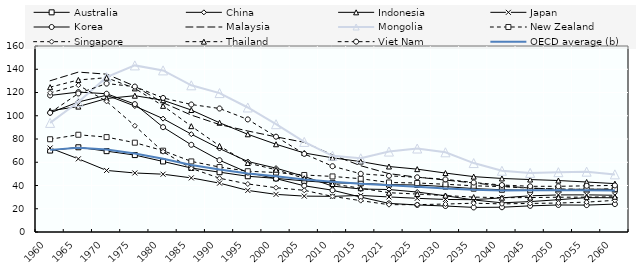
| Category | Australia | China | Indonesia | Japan | Korea | Malaysia | Mongolia | New Zealand | Singapore | Thailand | Viet Nam | OECD average (b) |
|---|---|---|---|---|---|---|---|---|---|---|---|---|
| 1960.0 | 70.051 | 102.435 | 104.271 | 72.241 | 117.466 | 130.089 | 93.835 | 79.8 | 119.711 | 124.572 | 102.552 | 70.643 |
| 1965.0 | 72.878 | 111.873 | 107.889 | 62.934 | 120.356 | 137.553 | 111.751 | 83.643 | 126.319 | 130.796 | 119.199 | 72.543 |
| 1970.0 | 69.556 | 117.649 | 114.832 | 52.969 | 118.927 | 135.774 | 133.173 | 81.627 | 112.347 | 132.723 | 127.67 | 70.866 |
| 1975.0 | 66.169 | 108.355 | 117.237 | 50.774 | 110.011 | 125.464 | 143.316 | 76.84 | 91.353 | 123.522 | 125.098 | 67.554 |
| 1980.0 | 60.675 | 97.511 | 113.324 | 49.724 | 90.192 | 111.181 | 139.009 | 69.95 | 69.075 | 108.514 | 115.306 | 63.089 |
| 1985.0 | 55.049 | 84.157 | 104.92 | 46.558 | 75.01 | 100.577 | 126.193 | 60.719 | 54.759 | 91.04 | 109.682 | 57.555 |
| 1990.0 | 51.44 | 71.78 | 93.984 | 42.026 | 61.736 | 92.421 | 119.49 | 55.89 | 46.242 | 74.069 | 106.247 | 53.682 |
| 1995.0 | 47.956 | 60.636 | 84.053 | 35.77 | 51.146 | 86.897 | 107.109 | 52.298 | 41.308 | 59.344 | 96.85 | 50.401 |
| 2000.0 | 46.118 | 54.946 | 75.473 | 32.369 | 45.89 | 81.841 | 92.712 | 51.164 | 38.093 | 53.579 | 81.989 | 47.866 |
| 2005.0 | 43.958 | 47.746 | 67.971 | 30.873 | 39.771 | 77.107 | 77.481 | 49.042 | 35.854 | 46.215 | 67.197 | 45.225 |
| 2010.0 | 42.275 | 39.499 | 63.803 | 30.668 | 35.934 | 66.291 | 65.549 | 47.798 | 30.59 | 41.3 | 56.596 | 43.171 |
| 2015.0 | 41.794 | 36.998 | 60.585 | 31.455 | 30.019 | 57.005 | 63.386 | 45.829 | 26.973 | 37.653 | 50.082 | 41.549 |
| 2021.0 | 40.778 | 36.544 | 56.339 | 30.161 | 24.611 | 50.201 | 69.171 | 42.596 | 23.494 | 33.79 | 48.315 | 40.271 |
| 2025.0 | 40.419 | 34.374 | 54.064 | 28.97 | 23.277 | 47.155 | 71.801 | 42.163 | 23.538 | 32.639 | 47.054 | 38.842 |
| 2030.0 | 39.046 | 31.183 | 50.698 | 27.994 | 22.357 | 44.686 | 68.54 | 41.065 | 24.041 | 31.327 | 45.271 | 37.449 |
| 2035.0 | 37.333 | 27.564 | 47.64 | 27.789 | 21.144 | 42.193 | 59.299 | 39.753 | 24.771 | 30.031 | 42.566 | 36.309 |
| 2040.0 | 36.366 | 25.102 | 46.049 | 29.393 | 21.307 | 39.643 | 52.661 | 39.067 | 24.205 | 29.526 | 40.392 | 35.782 |
| 2045.0 | 35.855 | 26.152 | 45.132 | 31.118 | 22.495 | 37.778 | 50.824 | 37.669 | 24.562 | 29.624 | 39.312 | 35.897 |
| 2050.0 | 35.786 | 27.792 | 44.283 | 31.904 | 23.236 | 36.871 | 51.456 | 36.806 | 24.924 | 29.906 | 39.31 | 35.991 |
| 2055.0 | 36.07 | 29.581 | 43.002 | 31.939 | 23.137 | 36.707 | 51.893 | 36.753 | 25.713 | 29.984 | 39.716 | 35.927 |
| 2060.0 | 36.411 | 29.434 | 41.607 | 31.613 | 24.016 | 36.894 | 49.559 | 37.038 | 27.239 | 30.308 | 40.064 | 35.77 |